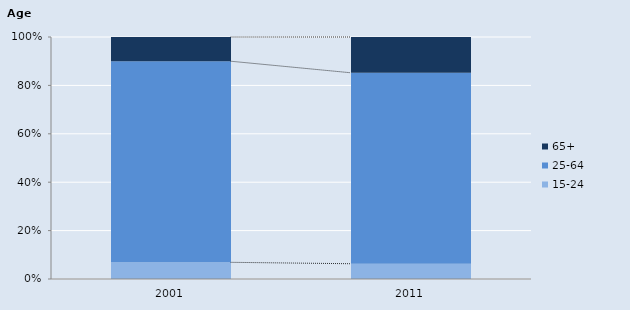
| Category | 15-24 | 25-64 | 65+            |
|---|---|---|---|
| 2001.0 | 82.197 | 991 | 119.51 |
| 2011.0 | 93 | 1163 | 218 |